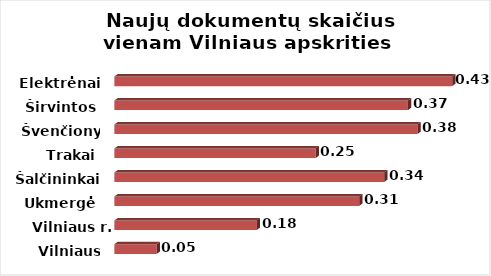
| Category | Series 0 |
|---|---|
| Vilniaus m. | 0.054 |
| Vilniaus r. | 0.18 |
| Ukmergė | 0.31 |
| Šalčininkai | 0.342 |
| Trakai | 0.255 |
| Švenčionys | 0.384 |
| Širvintos | 0.372 |
| Elektrėnai | 0.428 |